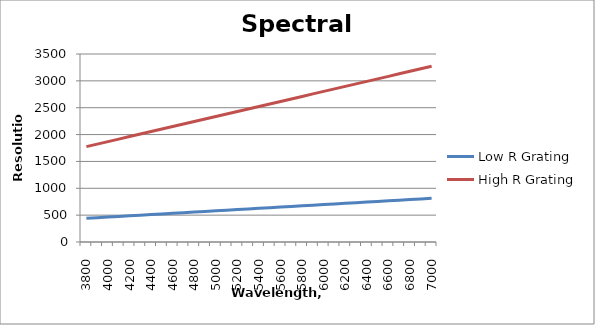
| Category | Low R Grating | High R Grating |
|---|---|---|
| 3800.0 | 441.86 | 1775.701 |
| 3900.0 | 453.488 | 1822.43 |
| 4000.0 | 465.116 | 1869.159 |
| 4100.0 | 476.744 | 1915.888 |
| 4200.0 | 488.372 | 1962.617 |
| 4300.0 | 500 | 2009.346 |
| 4400.0 | 511.628 | 2056.075 |
| 4500.0 | 523.256 | 2102.804 |
| 4600.0 | 534.884 | 2149.533 |
| 4700.0 | 546.512 | 2196.262 |
| 4800.0 | 558.14 | 2242.991 |
| 4900.0 | 569.767 | 2289.72 |
| 5000.0 | 581.395 | 2336.449 |
| 5100.0 | 593.023 | 2383.178 |
| 5200.0 | 604.651 | 2429.907 |
| 5300.0 | 616.279 | 2476.636 |
| 5400.0 | 627.907 | 2523.364 |
| 5500.0 | 639.535 | 2570.093 |
| 5600.0 | 651.163 | 2616.822 |
| 5700.0 | 662.791 | 2663.551 |
| 5800.0 | 674.419 | 2710.28 |
| 5900.0 | 686.047 | 2757.009 |
| 6000.0 | 697.674 | 2803.738 |
| 6100.0 | 709.302 | 2850.467 |
| 6200.0 | 720.93 | 2897.196 |
| 6300.0 | 732.558 | 2943.925 |
| 6400.0 | 744.186 | 2990.654 |
| 6500.0 | 755.814 | 3037.383 |
| 6600.0 | 767.442 | 3084.112 |
| 6700.0 | 779.07 | 3130.841 |
| 6800.0 | 790.698 | 3177.57 |
| 6900.0 | 802.326 | 3224.299 |
| 7000.0 | 813.953 | 3271.028 |